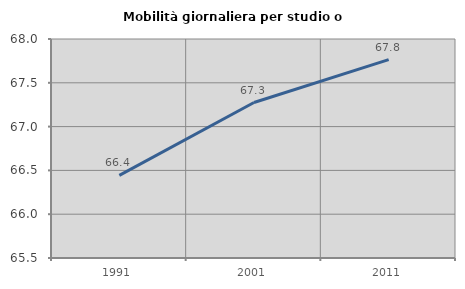
| Category | Mobilità giornaliera per studio o lavoro |
|---|---|
| 1991.0 | 66.443 |
| 2001.0 | 67.275 |
| 2011.0 | 67.764 |